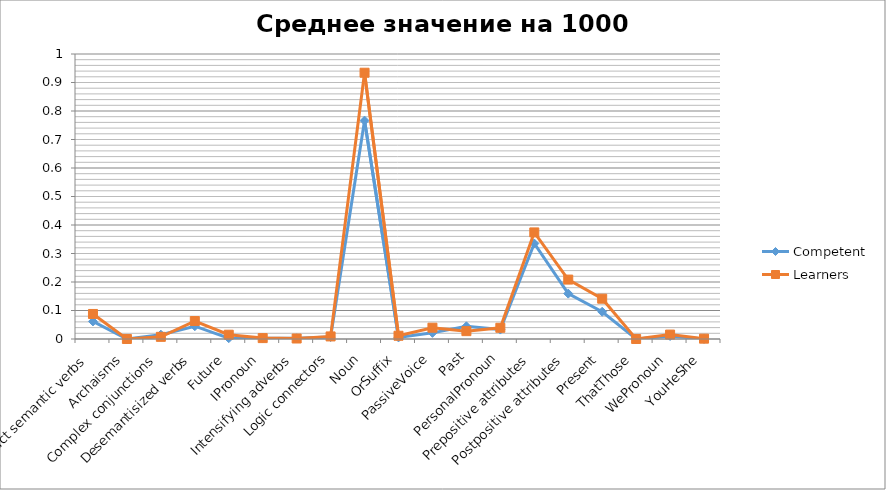
| Category | Competent | Learners |
|---|---|---|
| Abstract semantic verbs | 0.062 | 0.088 |
| Archaisms | 0 | 0 |
| Complex conjunctions | 0.015 | 0.008 |
| Desemantisized verbs | 0.045 | 0.063 |
| Future | 0.003 | 0.015 |
| IPronoun | 0.003 | 0.003 |
| Intensifying adverbs | 0.002 | 0.002 |
| Logic connectors | 0.007 | 0.009 |
| Noun | 0.766 | 0.934 |
| OrSuffix | 0.006 | 0.011 |
| PassiveVoice | 0.022 | 0.04 |
| Past | 0.045 | 0.028 |
| PersonalPronoun | 0.033 | 0.039 |
| Prepositive attributes | 0.335 | 0.374 |
| Postpositive attributes | 0.159 | 0.208 |
| Present | 0.096 | 0.141 |
| ThatThose | 0 | 0 |
| WePronoun | 0.011 | 0.016 |
| YouHeShe | 0 | 0.001 |